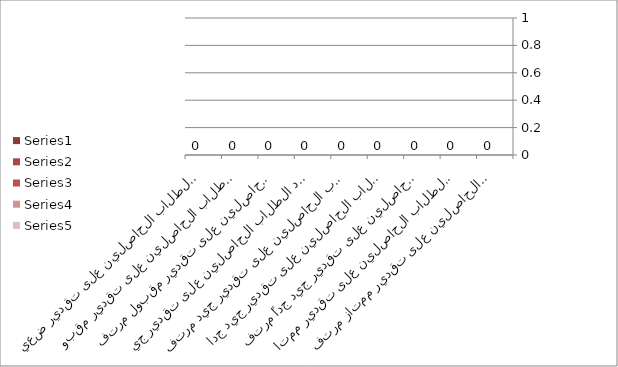
| Category | Series 0 | Series 1 | Series 2 | Series 3 | Series 4 |
|---|---|---|---|---|---|
| عدد الطلاب الحاصلين على تقدير ممتاز مرتفع |  |  |  | 0 |  |
| عدد الطلاب الحاصلين على تقدير ممتاز  |  |  |  | 0 |  |
| عدد الطلاب الحاصلين على تقدير جيد جداً مرتفع |  |  |  | 0 |  |
| عدد الطلاب الحاصلين على تقدير جيد جداً |  |  |  | 0 |  |
| عدد الطلاب الحاصلين على تقدير جيد مرتفع |  |  |  | 0 |  |
| عدد الطلاب الحاصلين على تقدير جيد  |  |  |  | 0 |  |
| عدد الطلاب الحاصلين على تقدير مقبول مرتفع |  |  |  | 0 |  |
| عدد الطلاب الحاصلين على تقدير مقبول  |  |  |  | 0 |  |
| عدد الطلاب الحاصلين على تقدير ضعيف |  |  |  | 0 |  |